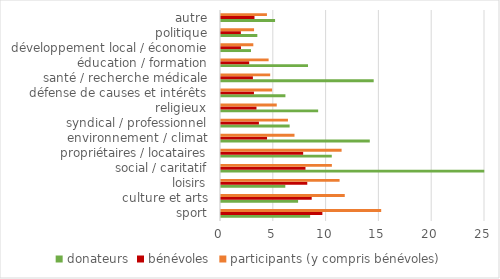
| Category | donateurs | bénévoles | participants (y compris bénévoles) |
|---|---|---|---|
| sport | 8.44 | 9.6 | 15.17 |
| culture et arts | 7.3 | 8.59 | 11.72 |
| loisirs | 6.09 | 8.17 | 11.23 |
| social / caritatif | 24.93 | 8 | 10.5 |
| propriétaires / locataires | 10.49 | 7.78 | 11.42 |
| environnement / climat | 14.09 | 4.36 | 6.96 |
| syndical / professionnel | 6.5 | 3.59 | 6.34 |
| religieux | 9.2 | 3.36 | 5.28 |
| défense de causes et intérêts | 6.1 | 3.12 | 4.84 |
| santé / recherche médicale | 14.46 | 3.02 | 4.66 |
| éducation / formation | 8.24 | 2.67 | 4.51 |
| développement local / économie | 2.84 | 1.89 | 3.06 |
| politique | 3.44 | 1.88 | 3.13 |
| autre | 5.12 | 3.17 | 4.35 |